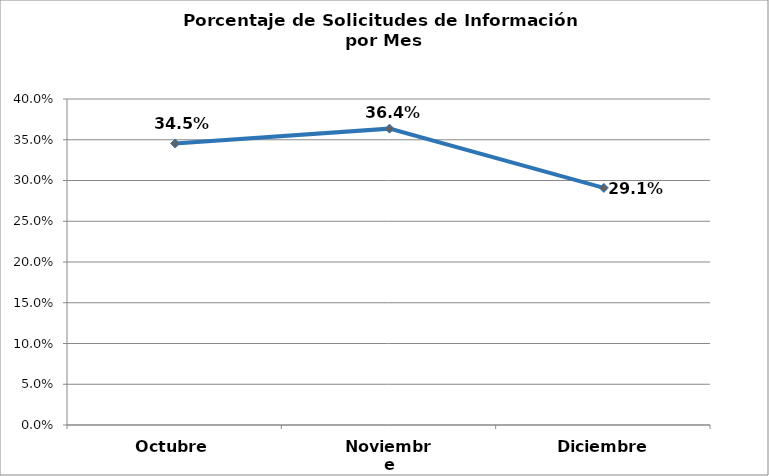
| Category | Series 0 |
|---|---|
| Octubre | 0.345 |
| Noviembre | 0.364 |
| Diciembre | 0.291 |